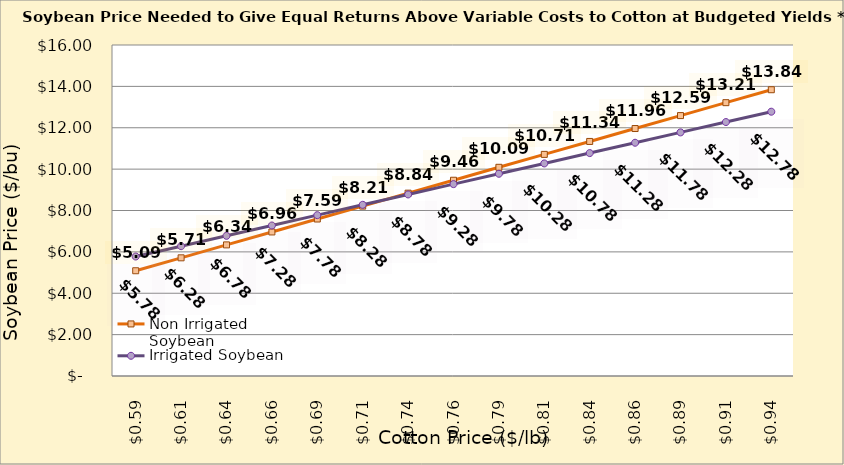
| Category | Non Irrigated Soybean | Irrigated Soybean |
|---|---|---|
| 0.5849999999999999 | 5.088 | 5.775 |
| 0.6099999999999999 | 5.713 | 6.275 |
| 0.6349999999999999 | 6.338 | 6.775 |
| 0.6599999999999999 | 6.963 | 7.275 |
| 0.6849999999999999 | 7.588 | 7.775 |
| 0.71 | 8.213 | 8.275 |
| 0.735 | 8.838 | 8.775 |
| 0.76 | 9.463 | 9.275 |
| 0.785 | 10.088 | 9.775 |
| 0.81 | 10.713 | 10.275 |
| 0.8350000000000001 | 11.338 | 10.775 |
| 0.8600000000000001 | 11.963 | 11.275 |
| 0.8850000000000001 | 12.588 | 11.775 |
| 0.9100000000000001 | 13.213 | 12.275 |
| 0.9350000000000002 | 13.838 | 12.775 |